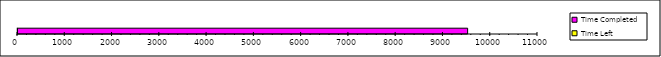
| Category | Time Completed | Time Left |
|---|---|---|
| 0 | 9532.755 | -2226.755 |